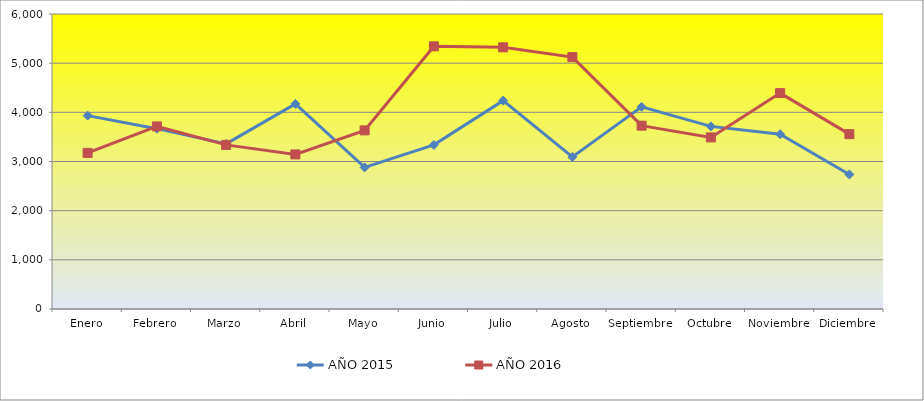
| Category | AÑO 2015 | AÑO 2016 |
|---|---|---|
| Enero | 3933 | 3175 |
| Febrero | 3668 | 3714 |
| Marzo | 3358 | 3338 |
| Abril | 4172 | 3144 |
| Mayo | 2880 | 3633 |
| Junio | 3338 | 5342 |
| Julio | 4238 | 5322 |
| Agosto | 3093 | 5123 |
| Septiembre | 4111 | 3729 |
| Octubre | 3714 | 3490 |
| Noviembre | 3556 | 4391 |
| Diciembre | 2737 | 3556 |